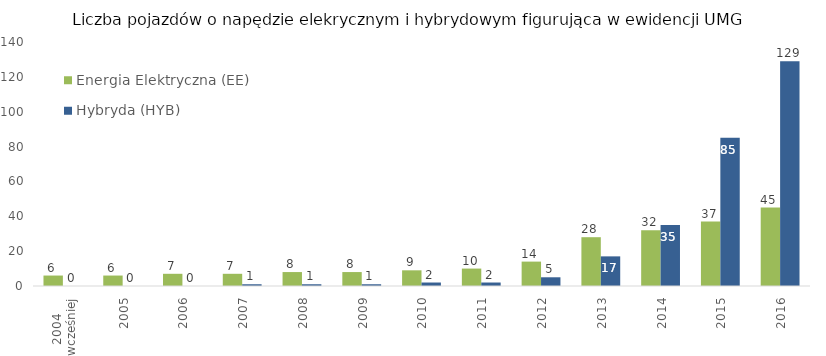
| Category | Energia Elektryczna (EE) | Hybryda (HYB) |
|---|---|---|
| 2004
i wcześniej | 6 | 0 |
| 2005 | 6 | 0 |
| 2006 | 7 | 0 |
| 2007 | 7 | 1 |
| 2008 | 8 | 1 |
| 2009 | 8 | 1 |
| 2010 | 9 | 2 |
| 2011 | 10 | 2 |
| 2012 | 14 | 5 |
| 2013 | 28 | 17 |
| 2014 | 32 | 35 |
| 2015 | 37 | 85 |
| 2016 | 45 | 129 |